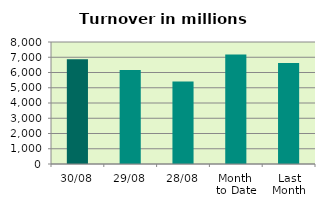
| Category | Series 0 |
|---|---|
| 30/08 | 6866.352 |
| 29/08 | 6158.303 |
| 28/08 | 5406.951 |
| Month 
to Date | 7181.07 |
| Last
Month | 6625.077 |